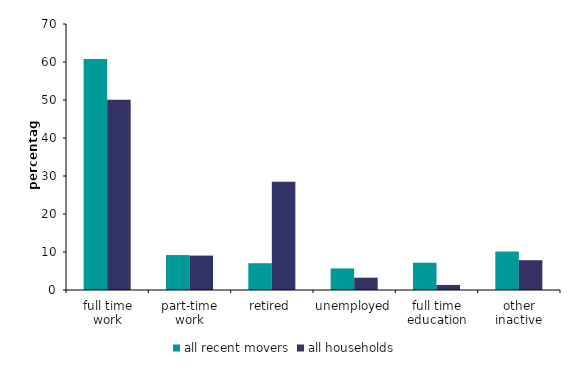
| Category | all recent movers | all households |
|---|---|---|
| full time work | 60.774 | 50.075 |
| part-time work | 9.196 | 9.054 |
| retired | 7.051 | 28.462 |
| unemployed | 5.677 | 3.235 |
| full time education | 7.175 | 1.337 |
| other inactive | 10.127 | 7.836 |